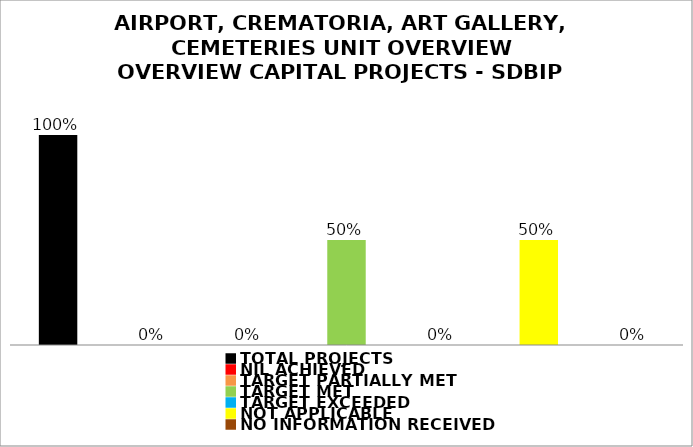
| Category | Series 1 |
|---|---|
| TOTAL PROJECTS | 1 |
| NIL ACHIEVED | 0 |
| TARGET PARTIALLY MET | 0 |
| TARGET MET | 0.5 |
| TARGET EXCEEDED | 0 |
| NOT APPLICABLE | 0.5 |
| NO INFORMATION RECEIVED | 0 |